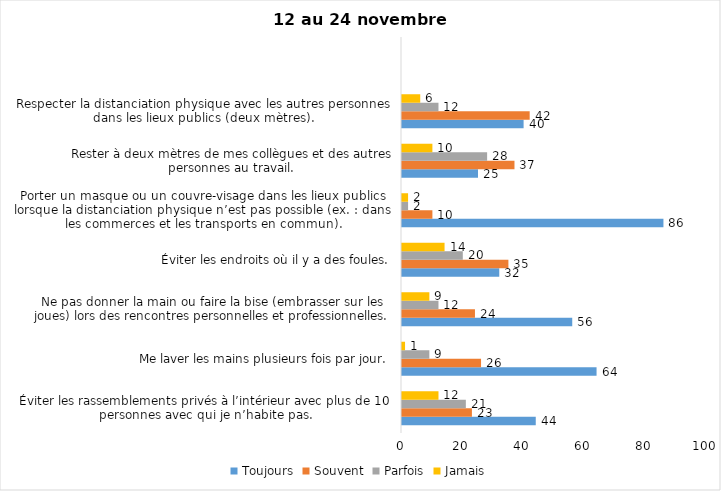
| Category | Toujours | Souvent | Parfois | Jamais |
|---|---|---|---|---|
| Éviter les rassemblements privés à l’intérieur avec plus de 10 personnes avec qui je n’habite pas. | 44 | 23 | 21 | 12 |
| Me laver les mains plusieurs fois par jour. | 64 | 26 | 9 | 1 |
| Ne pas donner la main ou faire la bise (embrasser sur les joues) lors des rencontres personnelles et professionnelles. | 56 | 24 | 12 | 9 |
| Éviter les endroits où il y a des foules. | 32 | 35 | 20 | 14 |
| Porter un masque ou un couvre-visage dans les lieux publics lorsque la distanciation physique n’est pas possible (ex. : dans les commerces et les transports en commun). | 86 | 10 | 2 | 2 |
| Rester à deux mètres de mes collègues et des autres personnes au travail. | 25 | 37 | 28 | 10 |
| Respecter la distanciation physique avec les autres personnes dans les lieux publics (deux mètres). | 40 | 42 | 12 | 6 |